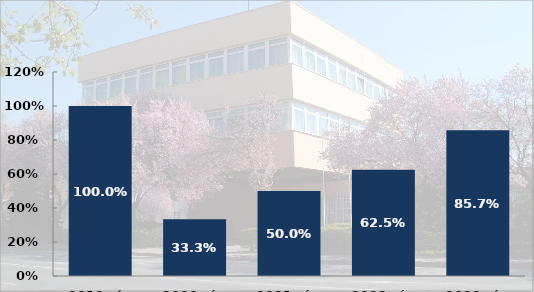
| Category | Tulajdon elleni szabálysértési ügyek felderítési mutatója |
|---|---|
| 2019. év | 1 |
| 2020. év | 0.333 |
| 2021. év | 0.5 |
| 2022. év | 0.625 |
| 2023. év | 0.857 |